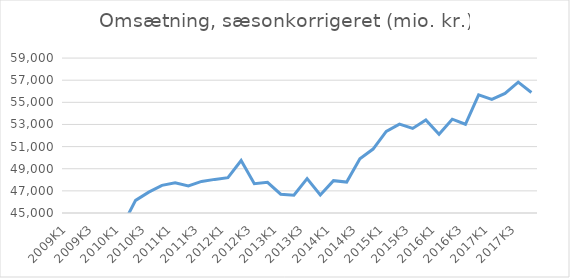
| Category | Omsætning, sæsonkorrigeret (mio. kr.) |
|---|---|
| 2009K1 | 42948.065 |
| 2009K2 | 41679.22 |
| 2009K3 | 42062.156 |
| 2009K4 | 42245.431 |
| 2010K1 | 43843.294 |
| 2010K2 | 46137.288 |
| 2010K3 | 46885.538 |
| 2010K4 | 47494.313 |
| 2011K1 | 47729.616 |
| 2011K2 | 47436.517 |
| 2011K3 | 47853.652 |
| 2011K4 | 48037.302 |
| 2012K1 | 48188.584 |
| 2012K2 | 49742.257 |
| 2012K3 | 47643.667 |
| 2012K4 | 47771.728 |
| 2013K1 | 46696.509 |
| 2013K2 | 46612.103 |
| 2013K3 | 48112.698 |
| 2013K4 | 46629.946 |
| 2014K1 | 47920.664 |
| 2014K2 | 47797.766 |
| 2014K3 | 49907.285 |
| 2014K4 | 50776.151 |
| 2015K1 | 52372.827 |
| 2015K2 | 53027.685 |
| 2015K3 | 52638.345 |
| 2015K4 | 53404.824 |
| 2016K1 | 52118.869 |
| 2016K2 | 53477.204 |
| 2016K3 | 53019.222 |
| 2016K4 | 55669.482 |
| 2017K1 | 55270.659 |
| 2017K2 | 55803.799 |
| 2017K3 | 56829.784 |
| 2017K4 | 55886.135 |